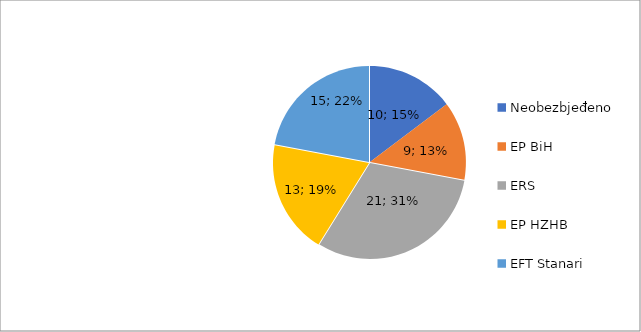
| Category | TR Nadole |
|---|---|
| Neobezbjeđeno | 10 |
| EP BiH | 9 |
| ERS | 21 |
| EP HZHB | 13 |
| EFT Stanari | 15 |